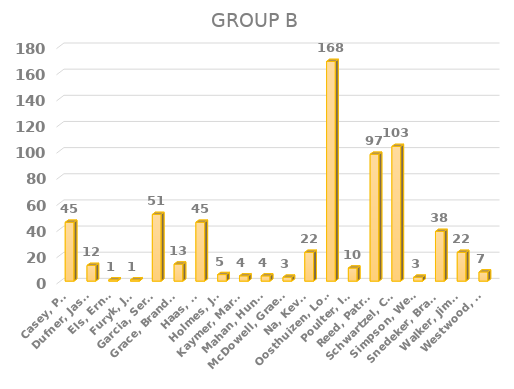
| Category | Series 0 |
|---|---|
| Casey, Paul | 45 |
| Dufner, Jason | 12 |
| Els, Ernie | 1 |
| Furyk, Jim | 1 |
| Garcia, Sergio | 51 |
| Grace, Branden | 13 |
| Haas, Bill | 45 |
| Holmes, J.B. | 5 |
| Kaymer, Martin | 4 |
| Mahan, Hunter | 4 |
| McDowell, Graeme | 3 |
| Na, Kevin | 22 |
| Oosthuizen, Louis | 168 |
| Poulter, Ian | 10 |
| Reed, Patrick | 97 |
| Schwartzel, Charl | 103 |
| Simpson, Webb | 3 |
| Snedeker, Brandt | 38 |
| Walker, Jimmy | 22 |
| Westwood, Lee | 7 |